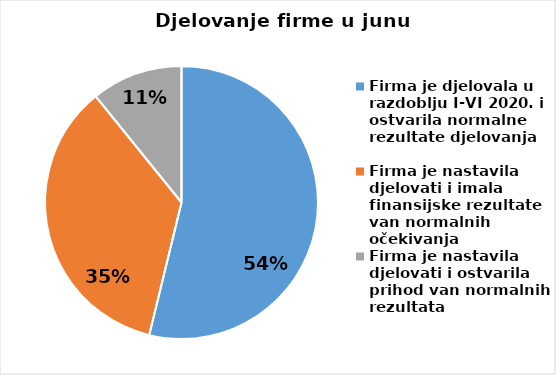
| Category | Series 0 |
|---|---|
| Firma je djelovala u razdoblju I-VI 2020. i ostvarila normalne rezultate djelovanja | 184 |
| Firma je nastavila djelovati i imala finansijske rezultate van normalnih očekivanja | 121 |
| Firma je nastavila djelovati i ostvarila prihod van normalnih rezultata | 37 |